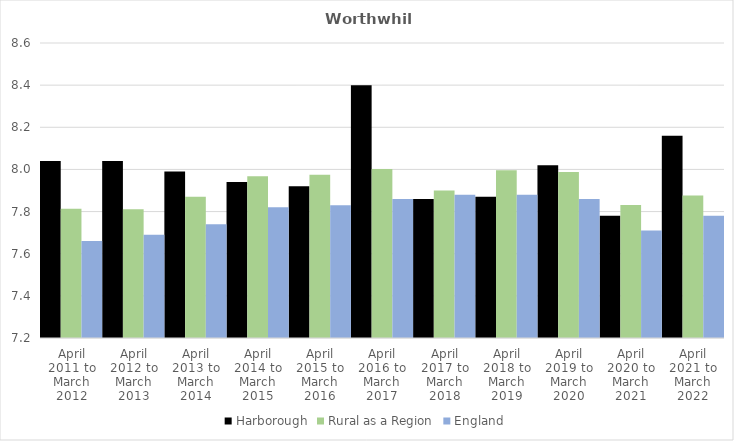
| Category | Harborough | Rural as a Region | England |
|---|---|---|---|
| April 2011 to March 2012 | 8.04 | 7.813 | 7.66 |
| April 2012 to March 2013 | 8.04 | 7.811 | 7.69 |
| April 2013 to March 2014 | 7.99 | 7.871 | 7.74 |
| April 2014 to March 2015 | 7.94 | 7.967 | 7.82 |
| April 2015 to March 2016 | 7.92 | 7.975 | 7.83 |
| April 2016 to March 2017 | 8.4 | 8.002 | 7.86 |
| April 2017 to March 2018 | 7.86 | 7.9 | 7.88 |
| April 2018 to March 2019 | 7.87 | 7.996 | 7.88 |
| April 2019 to March 2020 | 8.02 | 7.988 | 7.86 |
| April 2020 to March 2021 | 7.78 | 7.831 | 7.71 |
| April 2021 to March 2022 | 8.16 | 7.877 | 7.78 |